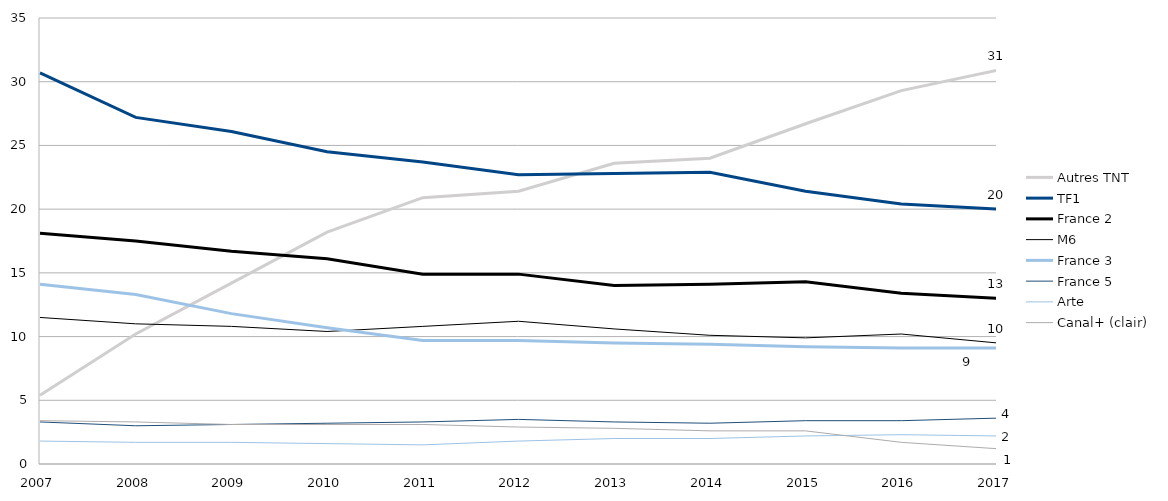
| Category | Autres TNT | TF1 | France 2 | M6 | France 3 | France 5 | Arte | Canal+ (clair) |
|---|---|---|---|---|---|---|---|---|
| 2007.0 | 5.4 | 30.7 | 18.1 | 11.5 | 14.1 | 3.3 | 1.8 | 3.4 |
| 2008.0 | 10.2 | 27.2 | 17.5 | 11 | 13.3 | 3 | 1.7 | 3.3 |
| 2009.0 | 14.2 | 26.1 | 16.7 | 10.8 | 11.8 | 3.1 | 1.7 | 3.1 |
| 2010.0 | 18.2 | 24.5 | 16.1 | 10.4 | 10.7 | 3.2 | 1.6 | 3.1 |
| 2011.0 | 20.9 | 23.7 | 14.9 | 10.8 | 9.7 | 3.3 | 1.5 | 3.1 |
| 2012.0 | 21.4 | 22.7 | 14.9 | 11.2 | 9.7 | 3.5 | 1.8 | 2.9 |
| 2013.0 | 23.6 | 22.8 | 14 | 10.6 | 9.5 | 3.3 | 2 | 2.8 |
| 2014.0 | 24 | 22.9 | 14.1 | 10.1 | 9.4 | 3.2 | 2 | 2.6 |
| 2015.0 | 26.7 | 21.4 | 14.3 | 9.9 | 9.2 | 3.4 | 2.2 | 2.6 |
| 2016.0 | 29.3 | 20.4 | 13.4 | 10.2 | 9.1 | 3.4 | 2.3 | 1.7 |
| 2017.0 | 30.9 | 20 | 13 | 9.5 | 9.1 | 3.6 | 2.2 | 1.2 |